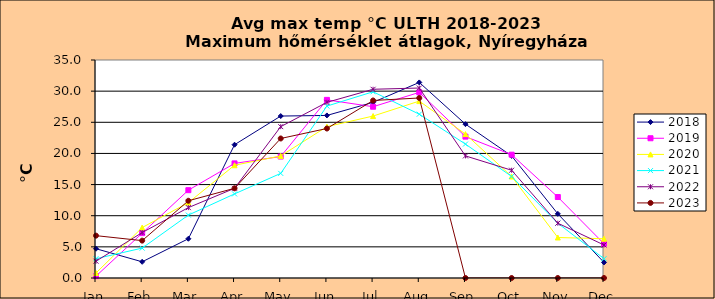
| Category | 2018 | 2019 | 2020 | 2021 | 2022 | 2023 |
|---|---|---|---|---|---|---|
| Jan | 4.7 | 0.3 | 0.8 | 3.1 | 2.7 | 6.8 |
| Feb | 2.6 | 7.2 | 8.1 | 4.8 | 7.3 | 6 |
| Mar | 6.3 | 14.1 | 12.1 | 10.1 | 11.3 | 12.4 |
| Apr | 21.4 | 18.4 | 18.1 | 13.5 | 14.4 | 14.4 |
| May | 26 | 19.5 | 19.6 | 16.8 | 24.3 | 22.4 |
| Jun | 26.1 | 28.6 | 24.3 | 27.6 | 28.2 | 24 |
| Jul | 28.2 | 27.5 | 26 | 29.9 | 30.3 | 28.5 |
| Aug | 31.4 | 29.8 | 28.4 | 26.3 | 30.5 | 28.9 |
| Sep | 24.7 | 22.7 | 23.1 | 21.5 | 19.6 | 0 |
| Oct | 19.6 | 19.8 | 16.3 | 16.3 | 17.3 | 0 |
| Nov | 10.3 | 13 | 6.5 | 8.8 | 8.8 | 0 |
| Dec | 2.5 | 5.5 | 6.3 | 3.1 | 5.3 | 0 |